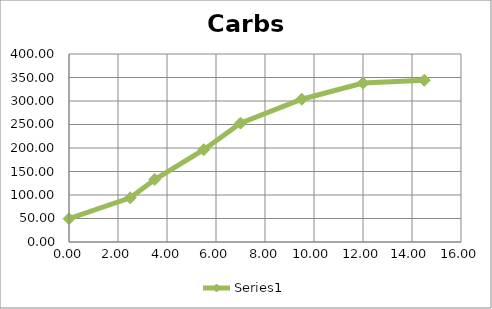
| Category | Series 0 |
|---|---|
| 0.0 | 49.584 |
| 2.5 | 93.984 |
| 3.5 | 132.984 |
| 5.5 | 196.284 |
| 7.0 | 252.804 |
| 9.5 | 303.774 |
| 12.0 | 338.094 |
| 14.5 | 344.094 |